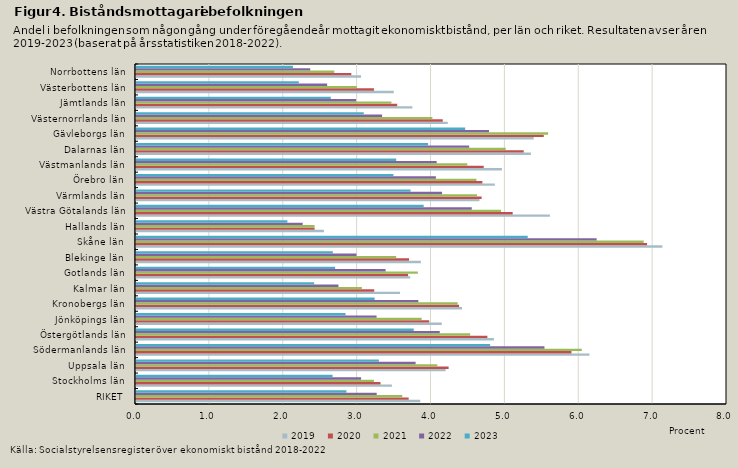
| Category | 2019 | 2020 | 2021 | 2022 | 2023 |
|---|---|---|---|---|---|
| RIKET | 3.848 | 3.691 | 3.604 | 3.258 | 2.848 |
| Stockholms län | 3.464 | 3.31 | 3.22 | 3.047 | 2.661 |
| Uppsala län | 4.191 | 4.232 | 4.079 | 3.785 | 3.288 |
| Södermanlands län | 6.138 | 5.895 | 6.035 | 5.529 | 4.794 |
| Östergötlands län | 4.845 | 4.756 | 4.524 | 4.112 | 3.759 |
| Jönköpings län | 4.139 | 3.969 | 3.866 | 3.257 | 2.837 |
| Kronobergs län | 4.413 | 4.373 | 4.354 | 3.821 | 3.23 |
| Kalmar län | 3.574 | 3.225 | 3.058 | 2.741 | 2.412 |
| Gotlands län | 3.711 | 3.683 | 3.815 | 3.379 | 2.696 |
| Blekinge län | 3.856 | 3.696 | 3.522 | 2.984 | 2.665 |
| Skåne län | 7.125 | 6.918 | 6.872 | 6.236 | 5.303 |
| Hallands län | 2.544 | 2.418 | 2.417 | 2.256 | 2.049 |
| Västra Götalands län | 5.603 | 5.099 | 4.941 | 4.545 | 3.894 |
| Värmlands län | 4.649 | 4.679 | 4.617 | 4.143 | 3.716 |
| Örebro län | 4.857 | 4.689 | 4.609 | 4.059 | 3.484 |
| Västmanlands län | 4.953 | 4.707 | 4.484 | 4.07 | 3.522 |
| Dalarnas län | 5.345 | 5.249 | 5.005 | 4.51 | 3.953 |
| Gävleborgs län | 5.384 | 5.52 | 5.579 | 4.778 | 4.455 |
| Västernorrlands län | 4.22 | 4.152 | 4.012 | 3.331 | 3.083 |
| Jämtlands län | 3.741 | 3.536 | 3.458 | 2.979 | 2.637 |
| Västerbottens län | 3.489 | 3.221 | 2.989 | 2.587 | 2.204 |
| Norrbottens län | 3.046 | 2.915 | 2.684 | 2.358 | 2.124 |